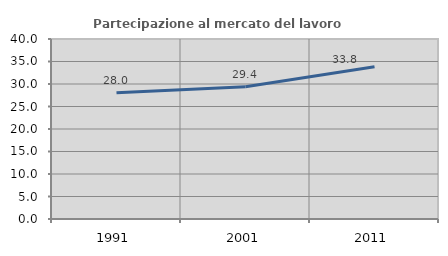
| Category | Partecipazione al mercato del lavoro  femminile |
|---|---|
| 1991.0 | 28.036 |
| 2001.0 | 29.399 |
| 2011.0 | 33.819 |